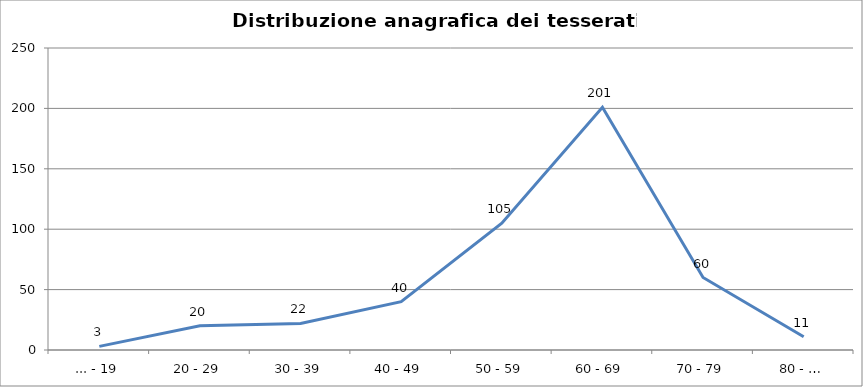
| Category | Nr. Tesserati |
|---|---|
| ... - 19 | 3 |
| 20 - 29 | 20 |
| 30 - 39 | 22 |
| 40 - 49 | 40 |
| 50 - 59 | 105 |
| 60 - 69 | 201 |
| 70 - 79 | 60 |
| 80 - … | 11 |